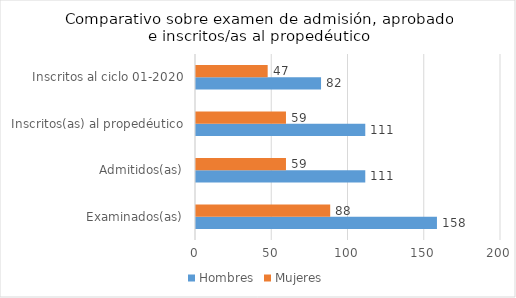
| Category | Hombres | Mujeres |
|---|---|---|
| Examinados(as) | 158 | 88 |
| Admitidos(as) | 111 | 59 |
| Inscritos(as) al propedéutico | 111 | 59 |
| Inscritos al ciclo 01-2020 | 82 | 47 |